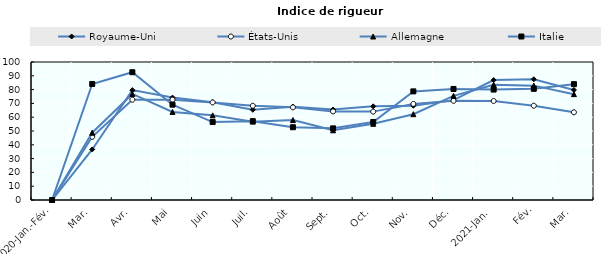
| Category | Royaume-Uni | États-Unis | Allemagne  | Italie  |
|---|---|---|---|---|
| 2020-Jan.-Fév. | 0 | 0 | 0 | 0 |
| Mar. | 36.633 | 45.775 | 48.775 | 84.069 |
| Avr. | 79.63 | 72.69 | 76.85 | 92.594 |
| Mai | 74.225 | 72.69 | 63.842 | 69.087 |
| Juin | 70.866 | 70.711 | 61.328 | 56.481 |
| Juil. | 65.381 | 68.264 | 56.794 | 57.136 |
| Août | 67.636 | 67.13 | 57.927 | 52.72 |
| Sept. | 65.569 | 64.198 | 50.496 | 51.913 |
| Oct. | 67.891 | 64.052 | 55.215 | 56.54 |
| Nov. | 68.331 | 69.629 | 62.179 | 78.703 |
| Déc. | 72.356 | 71.879 | 75.478 | 80.467 |
| 2021-Jan. | 86.885 | 71.76 | 83.511 | 80.016 |
| Fév. | 87.497 | 68.324 | 82.868 | 80.555 |
| Mar. | 79.748 | 63.574 | 76.704 | 83.962 |